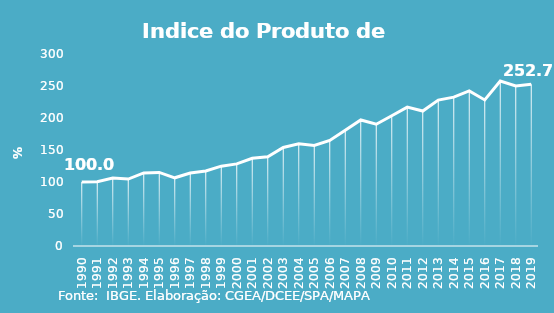
| Category | Indice de Prod. base 1990 |
|---|---|
| 1990.0 | 100 |
| 1991.0 | 100.275 |
| 1992.0 | 106.203 |
| 1993.0 | 104.57 |
| 1994.0 | 114.164 |
| 1995.0 | 115.024 |
| 1996.0 | 106.552 |
| 1997.0 | 114.037 |
| 1998.0 | 117.319 |
| 1999.0 | 124.734 |
| 2000.0 | 128.293 |
| 2001.0 | 136.975 |
| 2002.0 | 139.51 |
| 2003.0 | 153.868 |
| 2004.0 | 159.641 |
| 2005.0 | 157.136 |
| 2006.0 | 164.858 |
| 2007.0 | 180.781 |
| 2008.0 | 196.91 |
| 2009.0 | 190.309 |
| 2010.0 | 203.581 |
| 2011.0 | 217.041 |
| 2012.0 | 210.932 |
| 2013.0 | 228.009 |
| 2014.0 | 232.562 |
| 2015.0 | 242.318 |
| 2016.0 | 228.239 |
| 2017.0 | 257.766 |
| 2018.0 | 250.124 |
| 2019.0 | 252.69 |